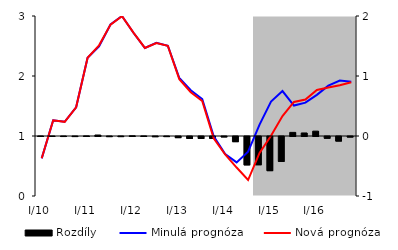
| Category | Rozdíly |
|---|---|
| 0 | 0.001 |
| 1 | 0 |
| 2 | -0.001 |
| 3 | -0.001 |
| 4 | 0.002 |
| 5 | 0.017 |
| 6 | -0.002 |
| 7 | -0.002 |
| 8 | 0.003 |
| 9 | 0.001 |
| 10 | -0.004 |
| 11 | -0.002 |
| 12 | -0.019 |
| 13 | -0.033 |
| 14 | -0.033 |
| 15 | -0.033 |
| 16 | -0.007 |
| 17 | -0.086 |
| 18 | -0.473 |
| 19 | -0.471 |
| 20 | -0.569 |
| 21 | -0.416 |
| 22 | 0.06 |
| 23 | 0.051 |
| 24 | 0.081 |
| 25 | -0.03 |
| 26 | -0.076 |
| 27 | -0.009 |